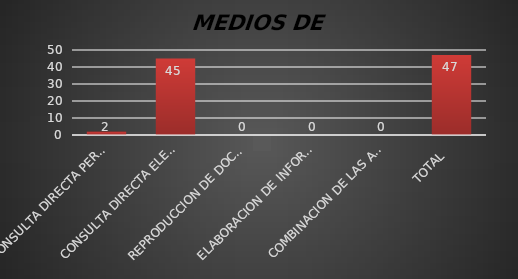
| Category | Series 1 |
|---|---|
| CONSULTA DIRECTA PERSONAL | 2 |
| CONSULTA DIRECTA ELECTRONICA | 45 |
| REPRODUCCION DE DOCUMENTOS  | 0 |
| ELABORACION DE INFORMES ESPECIFICOS  | 0 |
| COMBINACION DE LAS ANTERIORES | 0 |
| TOTAL  | 47 |